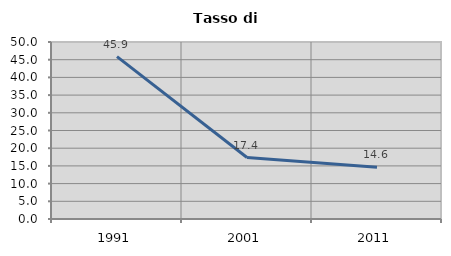
| Category | Tasso di disoccupazione   |
|---|---|
| 1991.0 | 45.882 |
| 2001.0 | 17.367 |
| 2011.0 | 14.599 |